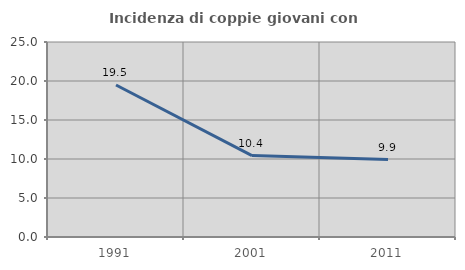
| Category | Incidenza di coppie giovani con figli |
|---|---|
| 1991.0 | 19.492 |
| 2001.0 | 10.435 |
| 2011.0 | 9.924 |